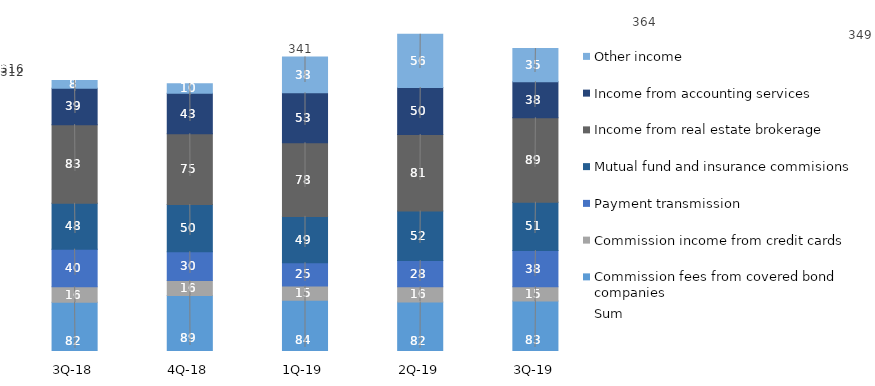
| Category | Commission fees from covered bond companies | Commission income from credit cards | Payment transmission | Mutual fund and insurance commisions | Income from real estate brokerage | Income from accounting services | Other income |
|---|---|---|---|---|---|---|---|
| 3Q-19 | 83.345 | 15 | 38 | 51 | 89 | 38 | 35 |
| 2Q-19 | 82.097 | 16.08 | 27.71 | 52.19 | 80.63 | 49.6 | 56.1 |
| 1Q-19 | 84.154 | 14.808 | 24.665 | 48.809 | 77.601 | 52.707 | 37.808 |
| 4Q-18 | 88.946 | 15.972 | 30.264 | 49.714 | 74.631 | 42.743 | 10.109 |
| 3Q-18 | 81.903 | 16.265 | 39.732 | 48.305 | 82.947 | 38.501 | 7.986 |